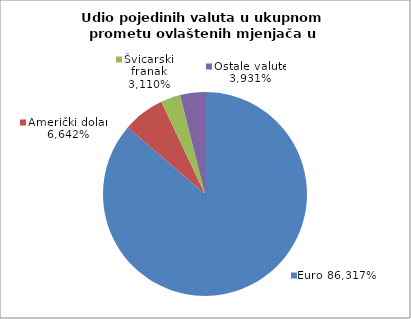
| Category | EUR |
|---|---|
| 0 | 0.863 |
| 1 | 0.066 |
| 2 | 0.031 |
| 3 | 0.039 |